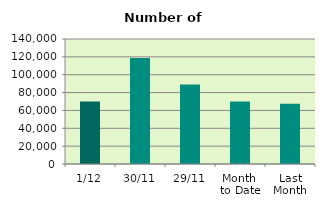
| Category | Series 0 |
|---|---|
| 1/12 | 70098 |
| 30/11 | 118652 |
| 29/11 | 88906 |
| Month 
to Date | 70098 |
| Last
Month | 67470.455 |